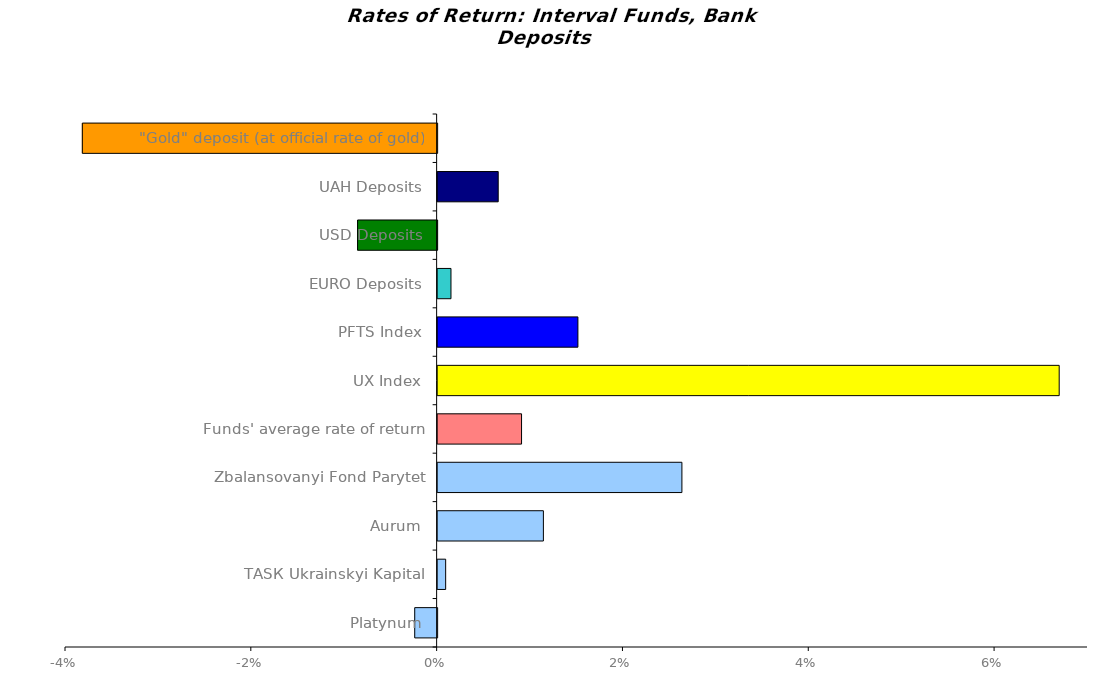
| Category | Series 0 |
|---|---|
| Platynum | -0.002 |
| ТАSК Ukrainskyi Kapital | 0.001 |
| Aurum | 0.011 |
| Zbalansovanyi Fond Parytet | 0.026 |
| Funds' average rate of return | 0.009 |
| UX Index | 0.067 |
| PFTS Index | 0.015 |
| EURO Deposits | 0.001 |
| USD Deposits | -0.009 |
| UAH Deposits | 0.007 |
| "Gold" deposit (at official rate of gold) | -0.038 |